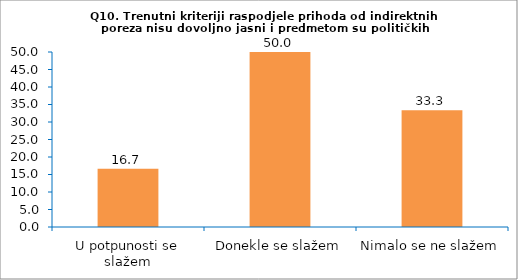
| Category | Series 0 |
|---|---|
| U potpunosti se slažem | 16.667 |
| Donekle se slažem | 50 |
| Nimalo se ne slažem | 33.333 |